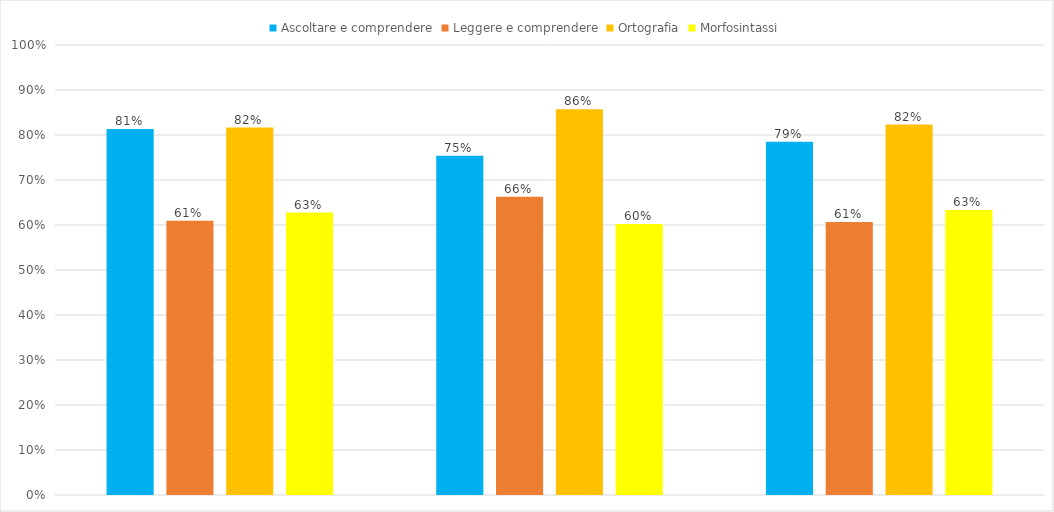
| Category | Ascoltare e comprendere | Leggere e comprendere | Ortografia | Morfosintassi |
|---|---|---|---|---|
| 2A Vivaldi | 0.813 | 0.609 | 0.817 | 0.628 |
| 2B Vivaldi | 0.754 | 0.663 | 0.857 | 0.602 |
| 2C Vivaldi | 0.785 | 0.607 | 0.823 | 0.633 |